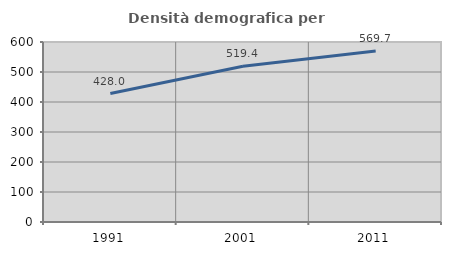
| Category | Densità demografica |
|---|---|
| 1991.0 | 428.036 |
| 2001.0 | 519.429 |
| 2011.0 | 569.728 |